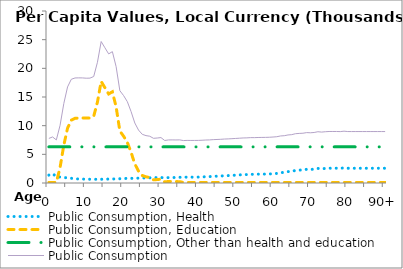
| Category | Public Consumption, Health | Public Consumption, Education | Public Consumption, Other than health and education | Public Consumption |
|---|---|---|---|---|
| 0 | 1374.539 | 98.408 | 6302.72 | 7775.667 |
|  | 1629.112 | 98.408 | 6302.72 | 8030.24 |
| 2 | 1110.962 | 98.408 | 6302.72 | 7512.09 |
| 3 | 1038.097 | 2714.769 | 6302.72 | 10055.586 |
| 4 | 965.233 | 6606.377 | 6302.72 | 13874.33 |
| 5 | 892.369 | 9559.188 | 6302.72 | 16754.276 |
| 6 | 818.8 | 10966.348 | 6302.72 | 18087.868 |
| 7 | 732.756 | 11284.431 | 6302.72 | 18319.907 |
| 8 | 701.88 | 11331.776 | 6302.72 | 18336.375 |
| 9 | 684.101 | 11342.723 | 6302.72 | 18329.543 |
| 10 | 660.021 | 11315.233 | 6302.72 | 18277.974 |
| 11 | 655.529 | 11332.286 | 6302.72 | 18290.534 |
| 12 | 647.48 | 11625.023 | 6302.72 | 18575.224 |
| 13 | 644.136 | 14109.312 | 6302.72 | 21056.167 |
| 14 | 651.281 | 17718.365 | 6302.72 | 24672.366 |
| 15 | 671.199 | 16613.973 | 6302.72 | 23587.891 |
| 16 | 685.445 | 15529.928 | 6302.72 | 22518.093 |
| 17 | 701.191 | 15906.424 | 6302.72 | 22910.334 |
| 18 | 714.958 | 13281.106 | 6302.72 | 20298.784 |
| 19 | 742.806 | 9055.135 | 6302.72 | 16100.661 |
| 20 | 782.775 | 8164.423 | 6302.72 | 15249.917 |
| 21 | 800.342 | 7080.373 | 6302.72 | 14183.435 |
| 22 | 800.414 | 5358.814 | 6302.72 | 12461.947 |
| 23 | 837.699 | 3327.359 | 6302.72 | 10467.777 |
| 24 | 850.431 | 2073.555 | 6302.72 | 9226.706 |
| 25 | 878.507 | 1310.546 | 6302.72 | 8491.773 |
| 26 | 882.581 | 1078.68 | 6302.72 | 8263.981 |
| 27 | 903.243 | 953.128 | 6302.72 | 8159.091 |
| 28 | 932.875 | 560.863 | 6302.72 | 7796.458 |
| 29 | 946.245 | 594.609 | 6302.72 | 7843.574 |
| 30 | 946.217 | 675.386 | 6302.72 | 7924.322 |
| 31 | 929.63 | 184.982 | 6302.72 | 7417.332 |
| 32 | 936.766 | 270.351 | 6302.72 | 7509.837 |
| 33 | 963.287 | 251.02 | 6302.72 | 7517.026 |
| 34 | 951.52 | 252.866 | 6302.72 | 7507.105 |
| 35 | 990.182 | 226.482 | 6302.72 | 7519.383 |
| 36 | 1001.133 | 98.408 | 6302.72 | 7402.261 |
| 37 | 1026.75 | 98.408 | 6302.72 | 7427.878 |
| 38 | 1022.395 | 98.408 | 6302.72 | 7423.523 |
| 39 | 1024.439 | 98.408 | 6302.72 | 7425.567 |
| 40 | 1030.114 | 98.408 | 6302.72 | 7431.242 |
| 41 | 1057.918 | 98.408 | 6302.72 | 7459.046 |
| 42 | 1095.84 | 98.408 | 6302.72 | 7496.968 |
| 43 | 1114.001 | 98.408 | 6302.72 | 7515.129 |
| 44 | 1163.127 | 98.408 | 6302.72 | 7564.255 |
| 45 | 1191.236 | 98.408 | 6302.72 | 7592.364 |
| 46 | 1220.204 | 98.408 | 6302.72 | 7621.332 |
| 47 | 1265.383 | 98.408 | 6302.72 | 7666.511 |
| 48 | 1290.641 | 98.408 | 6302.72 | 7691.769 |
| 49 | 1328.348 | 98.408 | 6302.72 | 7729.476 |
| 50 | 1370.182 | 98.408 | 6302.72 | 7771.31 |
| 51 | 1411.689 | 98.408 | 6302.72 | 7812.817 |
| 52 | 1455.638 | 98.408 | 6302.72 | 7856.766 |
| 53 | 1470.352 | 98.408 | 6302.72 | 7871.48 |
| 54 | 1514.514 | 98.408 | 6302.72 | 7915.642 |
| 55 | 1511.516 | 98.408 | 6302.72 | 7912.644 |
| 56 | 1536.994 | 98.408 | 6302.72 | 7938.122 |
| 57 | 1547.173 | 98.408 | 6302.72 | 7948.301 |
| 58 | 1554.863 | 98.408 | 6302.72 | 7955.991 |
| 59 | 1577.884 | 98.408 | 6302.72 | 7979.012 |
| 60 | 1616.72 | 98.408 | 6302.72 | 8017.848 |
| 61 | 1671.176 | 98.408 | 6302.72 | 8072.304 |
| 62 | 1803.152 | 98.408 | 6302.72 | 8204.28 |
| 63 | 1847.257 | 98.408 | 6302.72 | 8248.385 |
| 64 | 1978.8 | 98.408 | 6302.72 | 8379.928 |
| 65 | 2031.036 | 98.408 | 6302.72 | 8432.164 |
| 66 | 2195.421 | 98.408 | 6302.72 | 8596.549 |
| 67 | 2247.186 | 98.408 | 6302.72 | 8648.314 |
| 68 | 2279.016 | 98.408 | 6302.72 | 8680.144 |
| 69 | 2388.716 | 98.408 | 6302.72 | 8789.844 |
| 70 | 2358.857 | 98.408 | 6302.72 | 8759.985 |
| 71 | 2408.485 | 98.408 | 6302.72 | 8809.613 |
| 72 | 2541.373 | 98.408 | 6302.72 | 8942.502 |
| 73 | 2480.203 | 98.408 | 6302.72 | 8881.331 |
| 74 | 2541.847 | 98.408 | 6302.72 | 8942.975 |
| 75 | 2582.484 | 98.408 | 6302.72 | 8983.612 |
| 76 | 2583.673 | 98.408 | 6302.72 | 8984.801 |
| 77 | 2582.358 | 98.408 | 6302.72 | 8983.486 |
| 78 | 2564.524 | 98.408 | 6302.72 | 8965.652 |
| 79 | 2636.016 | 98.408 | 6302.72 | 9037.144 |
| 80 | 2572.828 | 98.408 | 6302.72 | 8973.956 |
| 81 | 2572.828 | 98.408 | 6302.72 | 8973.956 |
| 82 | 2572.828 | 98.408 | 6302.72 | 8973.956 |
| 83 | 2572.828 | 98.408 | 6302.72 | 8973.956 |
| 84 | 2572.828 | 98.408 | 6302.72 | 8973.956 |
| 85 | 2572.828 | 98.408 | 6302.72 | 8973.956 |
| 86 | 2572.828 | 98.408 | 6302.72 | 8973.956 |
| 87 | 2572.828 | 98.408 | 6302.72 | 8973.956 |
| 88 | 2572.828 | 98.408 | 6302.72 | 8973.956 |
| 89 | 2572.828 | 98.408 | 6302.72 | 8973.956 |
| 90+ | 2572.828 | 98.408 | 6302.72 | 8973.956 |